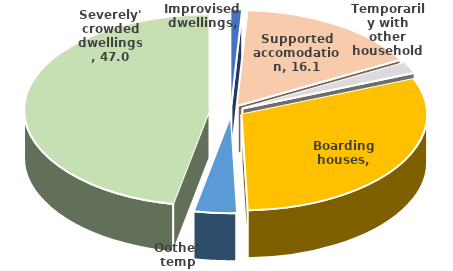
| Category | Series 0 |
|---|---|
| Improvised dwellings | 0.93 |
| Supported accomodation | 16.145 |
| Temporarily with other households | 1.902 |
| Boarding houses | 30.6 |
| Oother temp accom. | 3.677 |
| Severely' crowded dwellings | 46.957 |